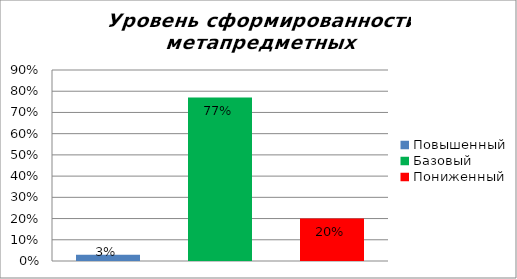
| Category | Уровень сформированности метапредметных результатов |
|---|---|
| Повышенный | 0.03 |
| Базовый | 0.77 |
| Пониженный | 0.2 |